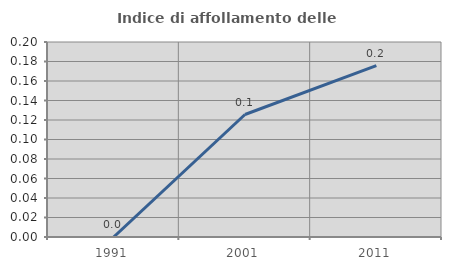
| Category | Indice di affollamento delle abitazioni  |
|---|---|
| 1991.0 | 0 |
| 2001.0 | 0.126 |
| 2011.0 | 0.176 |